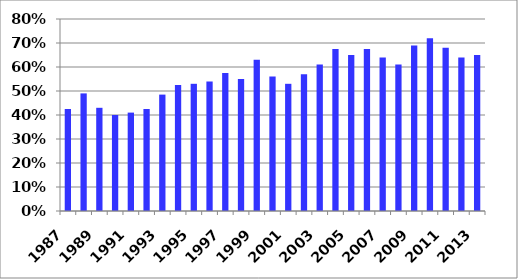
| Category | Series 1 |
|---|---|
| 1987.0 | 0.425 |
| 1988.0 | 0.49 |
| 1989.0 | 0.43 |
| 1990.0 | 0.4 |
| 1991.0 | 0.41 |
| 1992.0 | 0.425 |
| 1993.0 | 0.485 |
| 1994.0 | 0.525 |
| 1995.0 | 0.53 |
| 1996.0 | 0.54 |
| 1997.0 | 0.575 |
| 1998.0 | 0.55 |
| 1999.0 | 0.63 |
| 2000.0 | 0.56 |
| 2001.0 | 0.53 |
| 2002.0 | 0.57 |
| 2003.0 | 0.61 |
| 2004.0 | 0.675 |
| 2005.0 | 0.65 |
| 2006.0 | 0.675 |
| 2007.0 | 0.64 |
| 2008.0 | 0.61 |
| 2009.0 | 0.69 |
| 2010.0 | 0.72 |
| 2011.0 | 0.68 |
| 2012.0 | 0.64 |
| 2013.0 | 0.65 |